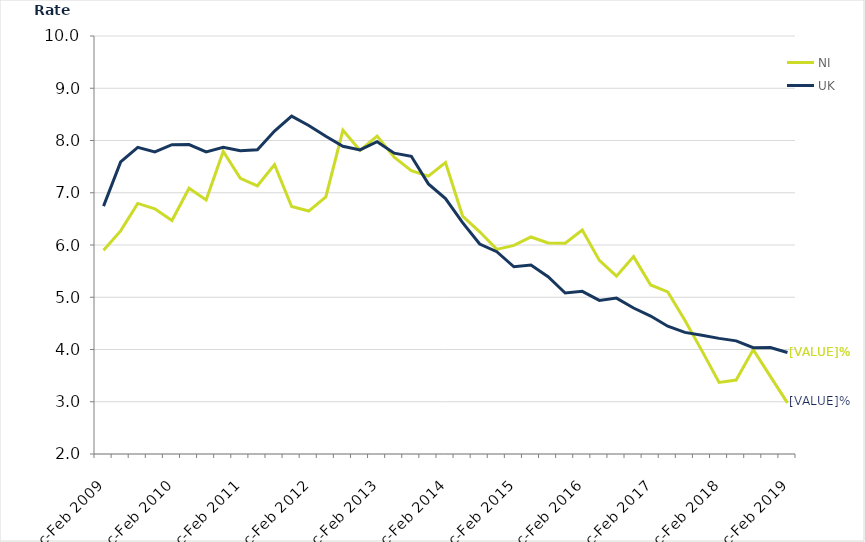
| Category | NI | UK |
|---|---|---|
| Dec-Feb 2009 | 5.897 | 6.744 |
| Mar-May 2009 | 6.27 | 7.59 |
| Jun-Aug 2009 | 6.796 | 7.87 |
| Sep-Nov 2009 | 6.693 | 7.781 |
| Dec-Feb 2010 | 6.47 | 7.92 |
| Mar-May 2010 | 7.085 | 7.923 |
| Jun-Aug 2010 | 6.862 | 7.782 |
| Sep-Nov 2010 | 7.791 | 7.871 |
| Dec-Feb 2011 | 7.277 | 7.803 |
| Mar-May 2011 | 7.133 | 7.822 |
| Jun-Aug 2011 | 7.538 | 8.181 |
| Sep-Nov 2011 | 6.736 | 8.467 |
| Dec-Feb 2012 | 6.65 | 8.289 |
| Mar-May 2012 | 6.922 | 8.08 |
| Jun-Aug 2012 | 8.196 | 7.89 |
| Sep-Nov 2012 | 7.81 | 7.82 |
| Dec-Feb 2013 | 8.083 | 7.976 |
| Mar-May 2013 | 7.68 | 7.758 |
| Jun-Aug 2013 | 7.422 | 7.698 |
| Sep-Nov 2013 | 7.318 | 7.17 |
| Dec-Feb 2014 | 7.578 | 6.889 |
| Mar-May 2014 | 6.554 | 6.428 |
| Jun-Aug 2014 | 6.253 | 6.019 |
| Sep-Nov 2014 | 5.916 | 5.871 |
| Dec-Feb 2015 | 5.991 | 5.583 |
| Mar-May 2015 | 6.154 | 5.617 |
| Jun-Aug 2015 | 6.039 | 5.392 |
| Sep-Nov 2015 | 6.033 | 5.081 |
| Dec-Feb 2016 | 6.288 | 5.113 |
| Mar-May 2016 | 5.706 | 4.939 |
| Jun-Aug 2016 | 5.404 | 4.983 |
| Sep-Nov 2016 | 5.778 | 4.794 |
| Dec-Feb 2017 | 5.235 | 4.64 |
| Mar-May 2017 | 5.102 | 4.445 |
| Jun-Aug 2017 | 4.558 | 4.328 |
| Sep-Nov 2017 | 3.974 | 4.272 |
| Dec-Feb 2018 | 3.371 | 4.213 |
| Mar-May 2018 | 3.416 | 4.165 |
| Jun-Aug 2018 | 3.999 | 4.035 |
| Sep-Nov 2018 | 3.486 | 4.039 |
| Dec-Feb 2019 | 2.979 | 3.942 |